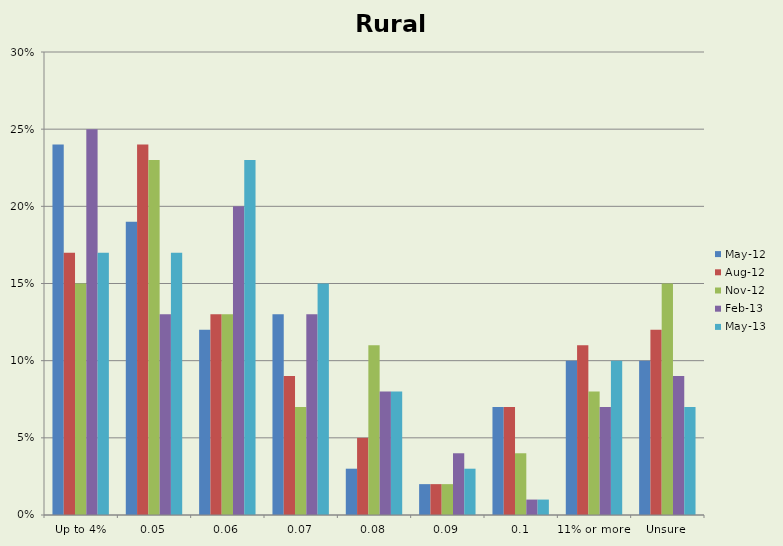
| Category | May-12 | Aug-12 | Nov-12 | Feb-13 | May-13 |
|---|---|---|---|---|---|
| Up to 4% | 0.24 | 0.17 | 0.15 | 0.25 | 0.17 |
| 5% | 0.19 | 0.24 | 0.23 | 0.13 | 0.17 |
| 6% | 0.12 | 0.13 | 0.13 | 0.2 | 0.23 |
| 7% | 0.13 | 0.09 | 0.07 | 0.13 | 0.15 |
| 8% | 0.03 | 0.05 | 0.11 | 0.08 | 0.08 |
| 9% | 0.02 | 0.02 | 0.02 | 0.04 | 0.03 |
| 10% | 0.07 | 0.07 | 0.04 | 0.01 | 0.01 |
| 11% or more | 0.1 | 0.11 | 0.08 | 0.07 | 0.1 |
| Unsure | 0.1 | 0.12 | 0.15 | 0.09 | 0.07 |